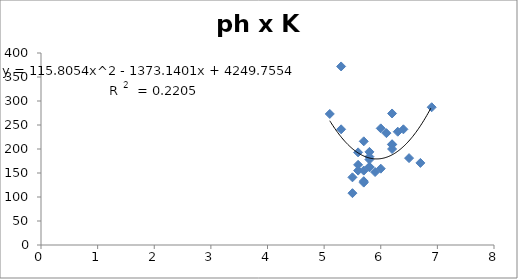
| Category | Series 0 |
|---|---|
| 6.3 | 236 |
| 6.2 | 210 |
| 6.2 | 200 |
| 6.5 | 181 |
| 6.7 | 171 |
| 6.9 | 287 |
| 6.4 | 241 |
| 5.3 | 241 |
| 5.5 | 108 |
| 5.7 | 130 |
| 5.8 | 162 |
| 6.2 | 209 |
| 6.1 | 233 |
| 6.0 | 243 |
| 5.7 | 216 |
| 5.8 | 163 |
| 5.3 | 372 |
| 5.1 | 273 |
| 5.6 | 167 |
| 5.7 | 133 |
| 5.7 | 155 |
| 5.8 | 178 |
| 5.6 | 193 |
| 6.2 | 274 |
| 5.6 | 155 |
| 5.5 | 141 |
| 5.8 | 194 |
| 5.8 | 184 |
| 5.9 | 152 |
| 6.0 | 159 |